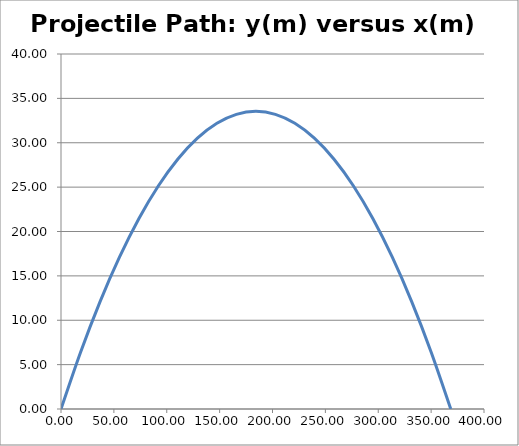
| Category | y(m) |
|---|---|
| 0.0 | 0 |
| 18.42854385569207 | 6.372 |
| 36.85708771138413 | 12.073 |
| 55.2856315670762 | 17.104 |
| 73.71417542276826 | 21.464 |
| 92.14271927846035 | 25.153 |
| 110.5712631341524 | 28.171 |
| 128.9998069898445 | 30.519 |
| 147.4283508455366 | 32.196 |
| 165.8568947012286 | 33.202 |
| 184.2854385569207 | 33.537 |
| 202.7139824126128 | 33.202 |
| 221.1425262683049 | 32.196 |
| 239.5710701239969 | 30.519 |
| 257.999613979689 | 28.171 |
| 276.4281578353811 | 25.153 |
| 294.8567016910732 | 21.464 |
| 313.2852455467652 | 17.104 |
| 331.7137894024572 | 12.073 |
| 350.1423332581493 | 6.372 |
| 368.5708771138413 | 0 |